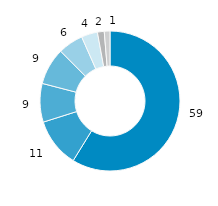
| Category | Berlin |
|---|---|
| gesetzliche
Kranken-versicherung | 58.809 |
| private Haushalte u. private Organi-sationen o. E. | 11.319 |
| private
Kranken-versicherung | 8.923 |
| soziale Pflegeversicherung | 8.527 |
| öffentliche Haushalte | 5.812 |
| Arbeitgeber | 3.733 |
| gesetzliche Unfallversicherung | 1.57 |
| gesetzliche
Renten-
versicherung | 1.315 |